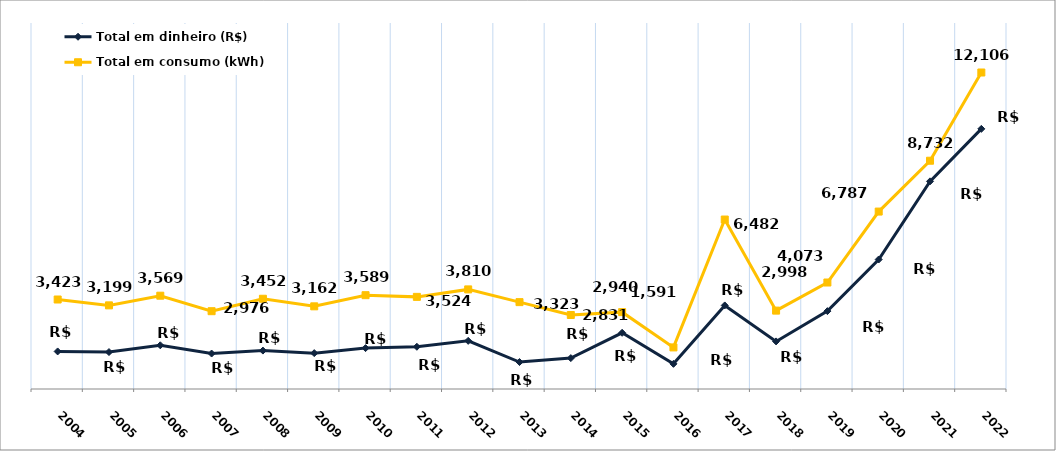
| Category | Total em dinheiro (R$) | Total em consumo (kWh) |
|---|---|---|
| 2004.0 | 1436.49 | 3423 |
| 2005.0 | 1413.1 | 3199 |
| 2006.0 | 1671.83 | 3569 |
| 2007.0 | 1356.62 | 2976 |
| 2008.0 | 1469.45 | 3452 |
| 2009.0 | 1371.85 | 3162 |
| 2010.0 | 1563.85 | 3589 |
| 2011.0 | 1615.32 | 3524 |
| 2012.0 | 1841.71 | 3810 |
| 2013.0 | 1031.04 | 3323 |
| 2014.0 | 1181.69 | 2831 |
| 2015.0 | 2149.91 | 2940 |
| 2016.0 | 961.81 | 1591 |
| 2017.0 | 3196.48 | 6482 |
| 2018.0 | 1820.12 | 2998 |
| 2019.0 | 2978.61 | 4073 |
| 2020.0 | 4954 | 6787 |
| 2021.0 | 7942.78 | 8732 |
| 2022.0 | 9950.89 | 12106 |